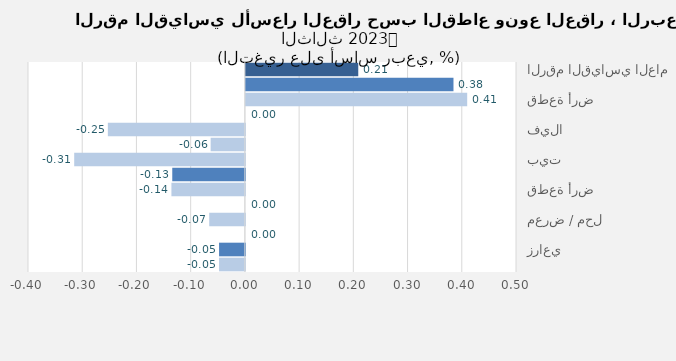
| Category | Series 0 |
|---|---|
| الرقم القياسي العام | 0.207 |
| سكني | 0.383 |
| قطعة أرض | 0.408 |
| عمارة | 0 |
| فيلا | -0.253 |
| شقة | -0.063 |
| بيت | -0.315 |
| تجاري | -0.134 |
| قطعة أرض | -0.135 |
| عمارة | 0 |
| معرض / محل | -0.066 |
| مركز تجاري | 0 |
| زراعي | -0.048 |
| أرض زراعية | -0.048 |